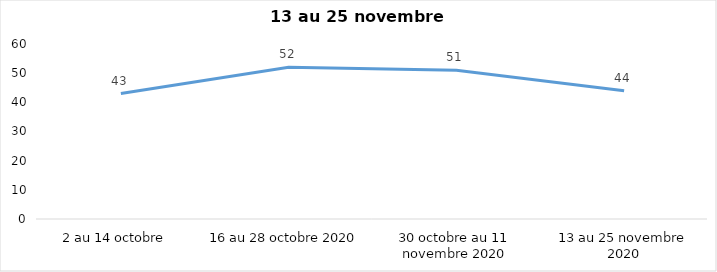
| Category | Series 0 |
|---|---|
| 2 au 14 octobre  | 43 |
| 16 au 28 octobre 2020 | 52 |
| 30 octobre au 11 novembre 2020 | 51 |
| 13 au 25 novembre 2020 | 44 |